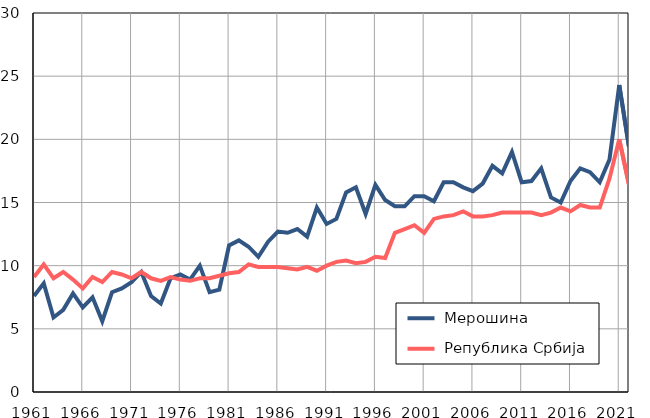
| Category |  Мерошина |  Република Србија |
|---|---|---|
| 1961.0 | 7.6 | 9.1 |
| 1962.0 | 8.6 | 10.1 |
| 1963.0 | 5.9 | 9 |
| 1964.0 | 6.5 | 9.5 |
| 1965.0 | 7.8 | 8.9 |
| 1966.0 | 6.7 | 8.2 |
| 1967.0 | 7.5 | 9.1 |
| 1968.0 | 5.6 | 8.7 |
| 1969.0 | 7.9 | 9.5 |
| 1970.0 | 8.2 | 9.3 |
| 1971.0 | 8.7 | 9 |
| 1972.0 | 9.5 | 9.5 |
| 1973.0 | 7.6 | 9 |
| 1974.0 | 7 | 8.8 |
| 1975.0 | 9 | 9.1 |
| 1976.0 | 9.3 | 8.9 |
| 1977.0 | 8.9 | 8.8 |
| 1978.0 | 10 | 9 |
| 1979.0 | 7.9 | 9 |
| 1980.0 | 8.1 | 9.2 |
| 1981.0 | 11.6 | 9.4 |
| 1982.0 | 12 | 9.5 |
| 1983.0 | 11.5 | 10.1 |
| 1984.0 | 10.7 | 9.9 |
| 1985.0 | 11.9 | 9.9 |
| 1986.0 | 12.7 | 9.9 |
| 1987.0 | 12.6 | 9.8 |
| 1988.0 | 12.9 | 9.7 |
| 1989.0 | 12.3 | 9.9 |
| 1990.0 | 14.6 | 9.6 |
| 1991.0 | 13.3 | 10 |
| 1992.0 | 13.7 | 10.3 |
| 1993.0 | 15.8 | 10.4 |
| 1994.0 | 16.2 | 10.2 |
| 1995.0 | 14.1 | 10.3 |
| 1996.0 | 16.4 | 10.7 |
| 1997.0 | 15.2 | 10.6 |
| 1998.0 | 14.7 | 12.6 |
| 1999.0 | 14.7 | 12.9 |
| 2000.0 | 15.5 | 13.2 |
| 2001.0 | 15.5 | 12.6 |
| 2002.0 | 15.1 | 13.7 |
| 2003.0 | 16.6 | 13.9 |
| 2004.0 | 16.6 | 14 |
| 2005.0 | 16.2 | 14.3 |
| 2006.0 | 15.9 | 13.9 |
| 2007.0 | 16.5 | 13.9 |
| 2008.0 | 17.9 | 14 |
| 2009.0 | 17.3 | 14.2 |
| 2010.0 | 19 | 14.2 |
| 2011.0 | 16.6 | 14.2 |
| 2012.0 | 16.7 | 14.2 |
| 2013.0 | 17.7 | 14 |
| 2014.0 | 15.4 | 14.2 |
| 2015.0 | 15 | 14.6 |
| 2016.0 | 16.7 | 14.3 |
| 2017.0 | 17.7 | 14.8 |
| 2018.0 | 17.4 | 14.6 |
| 2019.0 | 16.6 | 14.6 |
| 2020.0 | 18.4 | 16.9 |
| 2021.0 | 24.3 | 20 |
| 2022.0 | 19.4 | 16.4 |